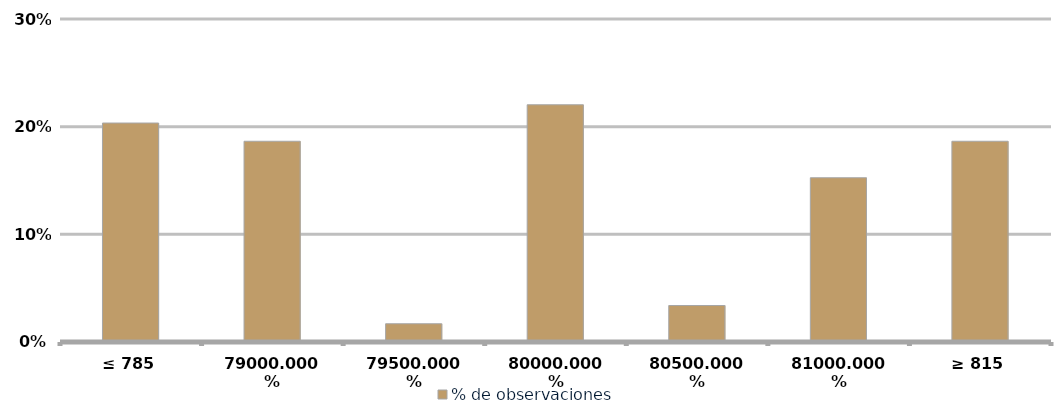
| Category | % de observaciones  |
|---|---|
| ≤ 785 | 0.203 |
| 790 | 0.186 |
| 795 | 0.017 |
| 800 | 0.22 |
| 805 | 0.034 |
| 810 | 0.153 |
| ≥ 815 | 0.186 |